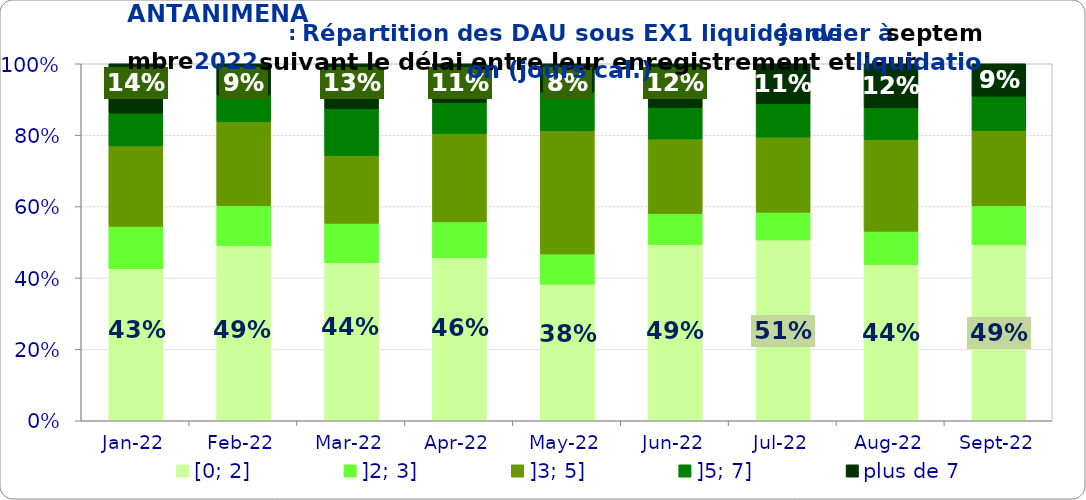
| Category | [0; 2] | ]2; 3] | ]3; 5] | ]5; 7] | plus de 7 |
|---|---|---|---|---|---|
| 2022-01-01 | 0.426 | 0.118 | 0.225 | 0.092 | 0.138 |
| 2022-02-01 | 0.491 | 0.111 | 0.236 | 0.074 | 0.088 |
| 2022-03-01 | 0.443 | 0.11 | 0.19 | 0.131 | 0.126 |
| 2022-04-01 | 0.457 | 0.1 | 0.248 | 0.087 | 0.109 |
| 2022-05-01 | 0.382 | 0.085 | 0.345 | 0.108 | 0.08 |
| 2022-06-01 | 0.494 | 0.087 | 0.209 | 0.088 | 0.123 |
| 2022-07-01 | 0.506 | 0.078 | 0.21 | 0.094 | 0.112 |
| 2022-08-01 | 0.438 | 0.093 | 0.257 | 0.088 | 0.124 |
| 2022-09-01 | 0.494 | 0.108 | 0.211 | 0.096 | 0.091 |